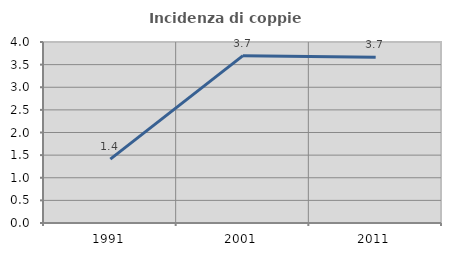
| Category | Incidenza di coppie miste |
|---|---|
| 1991.0 | 1.411 |
| 2001.0 | 3.698 |
| 2011.0 | 3.666 |